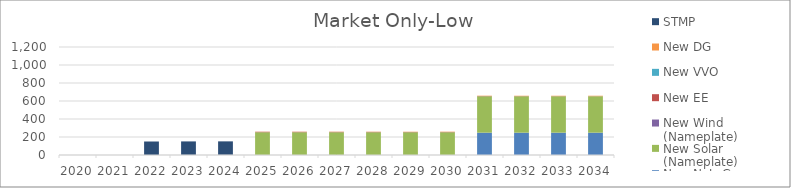
| Category | New Nat. Gas | New Solar (Nameplate) | New Wind (Nameplate) | New EE | New VVO | New DG | STMP |
|---|---|---|---|---|---|---|---|
| 2020.0 | 0 | 0 | 0 | 0 | 0 | 0 | 0 |
| 2021.0 | 0 | 0 | 0 | 0 | 0 | 0 | 0 |
| 2022.0 | 0 | 0 | 0 | 0 | 0 | 0 | 150 |
| 2023.0 | 0 | 0 | 0 | 0 | 0 | 1.022 | 150 |
| 2024.0 | 0 | 0 | 0 | 0 | 0 | 1.533 | 150 |
| 2025.0 | 0 | 252.994 | 0 | 4.957 | 0 | 1.533 | 0 |
| 2026.0 | 0 | 252.994 | 0 | 4.776 | 0 | 1.533 | 0 |
| 2027.0 | 0 | 252.994 | 0 | 4.296 | 0 | 2.044 | 0 |
| 2028.0 | 0 | 252.994 | 0 | 3.973 | 0 | 2.044 | 0 |
| 2029.0 | 0 | 252.994 | 0 | 2.99 | 0 | 2.555 | 0 |
| 2030.0 | 0 | 252.994 | 0 | 3.109 | 0 | 3.066 | 0 |
| 2031.0 | 248 | 404.791 | 0 | 2.514 | 0 | 3.577 | 0 |
| 2032.0 | 248 | 404.791 | 0 | 1.961 | 0 | 3.577 | 0 |
| 2033.0 | 248 | 404.791 | 0 | 1.417 | 0 | 4.088 | 0 |
| 2034.0 | 248 | 404.791 | 0 | 1.041 | 0 | 4.599 | 0 |